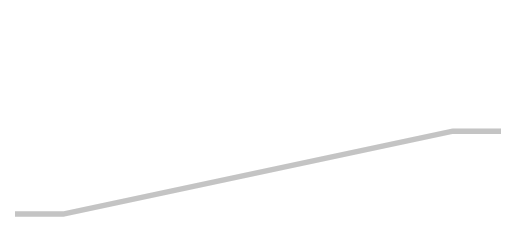
| Category | S1 | S2 | S3 |
|---|---|---|---|
| 0.0 | 1730 | 50 | 150 |
| 10.0 | 1730 | 50 | 150 |
| 90.0 | 970 | 50 | 910 |
| 100.0 | 970 | 50 | 910 |